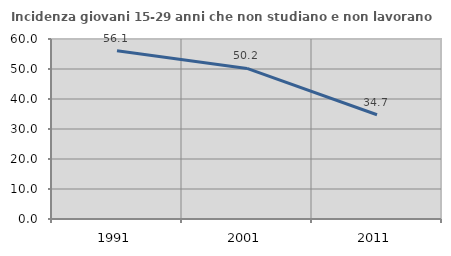
| Category | Incidenza giovani 15-29 anni che non studiano e non lavorano  |
|---|---|
| 1991.0 | 56.109 |
| 2001.0 | 50.18 |
| 2011.0 | 34.744 |